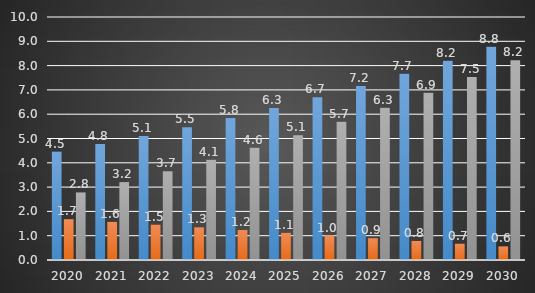
| Category | סכום של שווי תחנה | סכום של קרן חוב | סכום של שווי הון עצמי |
|---|---|---|---|
| 2020 | 4.461 | 1.68 | 2.781 |
| 2021 | 4.774 | 1.568 | 3.206 |
| 2022 | 5.108 | 1.456 | 3.652 |
| 2023 | 5.465 | 1.344 | 4.121 |
| 2024 | 5.848 | 1.232 | 4.616 |
| 2025 | 6.257 | 1.12 | 5.137 |
| 2026 | 6.695 | 1.008 | 5.687 |
| 2027 | 7.164 | 0.896 | 6.268 |
| 2028 | 7.665 | 0.784 | 6.881 |
| 2029 | 8.202 | 0.672 | 7.53 |
| 2030 | 8.776 | 0.56 | 8.216 |